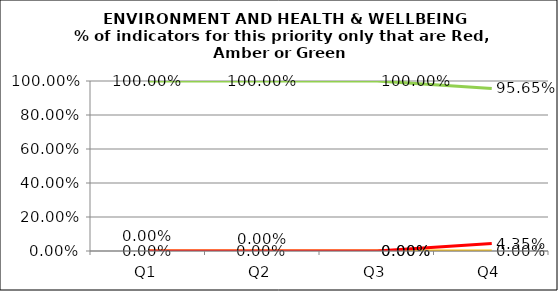
| Category | Green | Amber | Red |
|---|---|---|---|
| Q1 | 1 | 0 | 0 |
| Q2 | 1 | 0 | 0 |
| Q3 | 1 | 0 | 0 |
| Q4 | 0.957 | 0 | 0.043 |